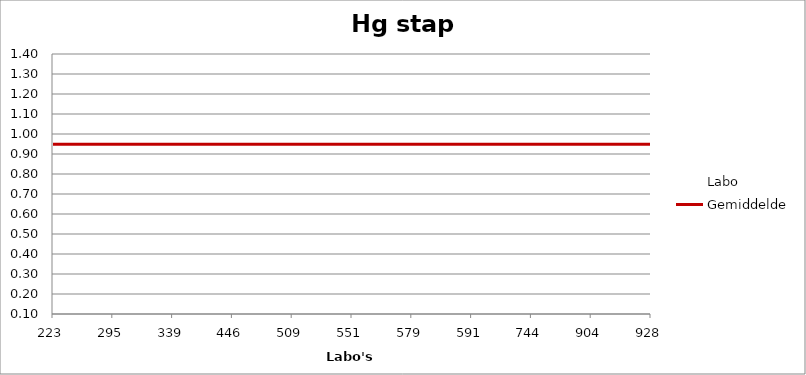
| Category | Labo | Gemiddelde |
|---|---|---|
| 223.0 | 1.072 | 0.949 |
| 295.0 | 1.017 | 0.949 |
| 339.0 | 0.859 | 0.949 |
| 446.0 | 0.121 | 0.949 |
| 509.0 | 0.953 | 0.949 |
| 551.0 | 0.001 | 0.949 |
| 579.0 | 0.907 | 0.949 |
| 591.0 | 0.424 | 0.949 |
| 744.0 | 0.895 | 0.949 |
| 904.0 | 1.022 | 0.949 |
| 928.0 | 1.398 | 0.949 |